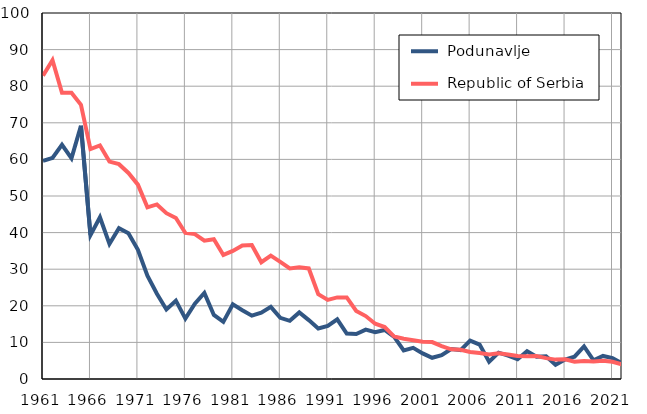
| Category |  Podunavlje |  Republic of Serbia |
|---|---|---|
| 1961.0 | 59.6 | 82.9 |
| 1962.0 | 60.4 | 87.1 |
| 1963.0 | 64 | 78.2 |
| 1964.0 | 60.3 | 78.2 |
| 1965.0 | 69.2 | 74.9 |
| 1966.0 | 39.3 | 62.8 |
| 1967.0 | 44.2 | 63.8 |
| 1968.0 | 36.9 | 59.4 |
| 1969.0 | 41.2 | 58.7 |
| 1970.0 | 39.8 | 56.3 |
| 1971.0 | 35.3 | 53.1 |
| 1972.0 | 28.2 | 46.9 |
| 1973.0 | 23.3 | 47.7 |
| 1974.0 | 19 | 45.3 |
| 1975.0 | 21.4 | 44 |
| 1976.0 | 16.5 | 39.9 |
| 1977.0 | 20.6 | 39.6 |
| 1978.0 | 23.5 | 37.8 |
| 1979.0 | 17.5 | 38.2 |
| 1980.0 | 15.6 | 33.9 |
| 1981.0 | 20.4 | 35 |
| 1982.0 | 18.8 | 36.5 |
| 1983.0 | 17.3 | 36.6 |
| 1984.0 | 18.1 | 31.9 |
| 1985.0 | 19.7 | 33.7 |
| 1986.0 | 16.7 | 32 |
| 1987.0 | 15.9 | 30.2 |
| 1988.0 | 18.2 | 30.5 |
| 1989.0 | 16.1 | 30.2 |
| 1990.0 | 13.8 | 23.2 |
| 1991.0 | 14.5 | 21.6 |
| 1992.0 | 16.3 | 22.3 |
| 1993.0 | 12.4 | 22.3 |
| 1994.0 | 12.3 | 18.6 |
| 1995.0 | 13.5 | 17.2 |
| 1996.0 | 12.8 | 15.1 |
| 1997.0 | 13.4 | 14.2 |
| 1998.0 | 11.5 | 11.6 |
| 1999.0 | 7.8 | 11 |
| 2000.0 | 8.5 | 10.6 |
| 2001.0 | 7 | 10.2 |
| 2002.0 | 5.8 | 10.1 |
| 2003.0 | 6.5 | 9 |
| 2004.0 | 8.2 | 8.1 |
| 2005.0 | 7.9 | 8 |
| 2006.0 | 10.5 | 7.4 |
| 2007.0 | 9.4 | 7.1 |
| 2008.0 | 4.7 | 6.7 |
| 2009.0 | 7.2 | 7 |
| 2010.0 | 6.4 | 6.7 |
| 2011.0 | 5.4 | 6.3 |
| 2012.0 | 7.6 | 6.2 |
| 2013.0 | 6.1 | 6.3 |
| 2014.0 | 6.2 | 5.7 |
| 2015.0 | 3.9 | 5.3 |
| 2016.0 | 5.3 | 5.4 |
| 2017.0 | 6.1 | 4.7 |
| 2018.0 | 8.9 | 4.9 |
| 2019.0 | 5.1 | 4.8 |
| 2020.0 | 6.3 | 5 |
| 2021.0 | 5.7 | 4.7 |
| 2022.0 | 4.3 | 4 |